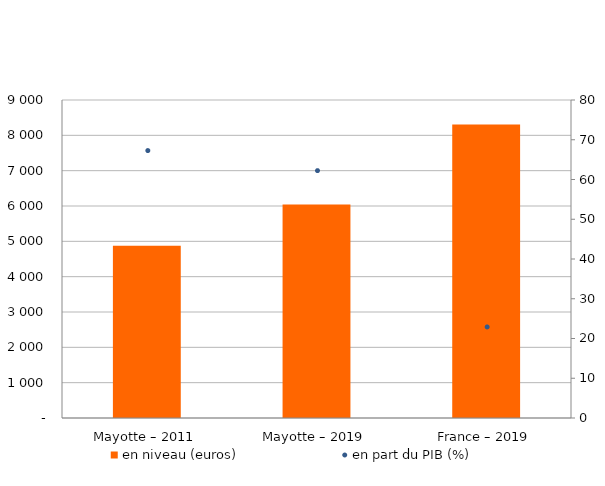
| Category | en niveau (euros) |
|---|---|
| Mayotte – 2011 | 4873.097 |
| Mayotte – 2019 | 6039.613 |
| France – 2019 | 8305.529 |